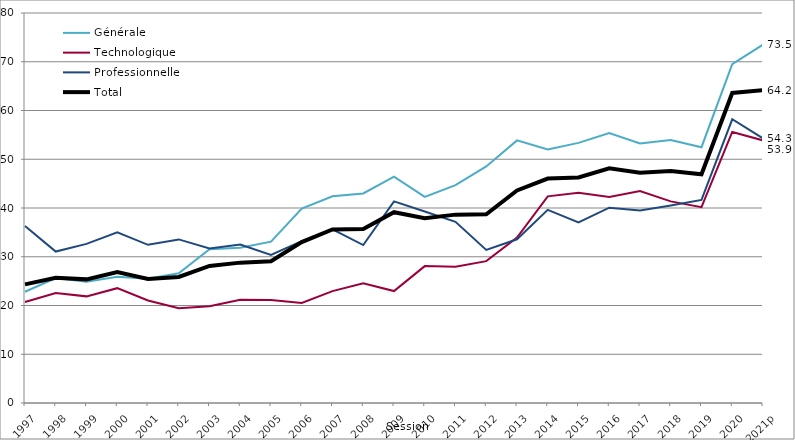
| Category | Générale | Technologique | Professionnelle | Total |
|---|---|---|---|---|
| 1997 | 22.818 | 20.715 | 36.321 | 24.326 |
| 1998 | 25.647 | 22.577 | 31.066 | 25.675 |
| 1999 | 24.878 | 21.873 | 32.634 | 25.361 |
| 2000 | 25.92 | 23.555 | 34.996 | 26.852 |
| 2001 | 25.47 | 21.037 | 32.446 | 25.459 |
| 2002 | 26.609 | 19.447 | 33.557 | 25.853 |
| 2003 | 31.536 | 19.859 | 31.708 | 28.105 |
| 2004 | 31.826 | 21.194 | 32.52 | 28.794 |
| 2005 | 33.105 | 21.134 | 30.36 | 29.074 |
| 2006 | 39.877 | 20.514 | 33.197 | 33.001 |
| 2007 | 42.416 | 22.946 | 35.612 | 35.592 |
| 2008 | 42.99 | 24.581 | 32.404 | 35.694 |
| 2009 | 46.45 | 22.956 | 41.37 | 39.136 |
| 2010 | 42.28 | 28.079 | 39.296 | 37.882 |
| 2011 | 44.695 | 27.957 | 37.172 | 38.641 |
| 2012 | 48.522 | 29.099 | 31.394 | 38.698 |
| 2013 | 53.872 | 33.942 | 33.584 | 43.592 |
| 2014 | 52.016 | 42.387 | 39.622 | 46.037 |
| 2015 | 53.353 | 43.117 | 37.058 | 46.269 |
| 2016 | 55.359 | 42.281 | 40.062 | 48.144 |
| 2017 | 53.247 | 43.473 | 39.47 | 47.256 |
| 2018 | 53.943 | 41.353 | 40.53 | 47.601 |
| 2019 | 52.47 | 40.16 | 41.65 | 46.91 |
| 2020 | 69.5 | 55.6 | 58.2 | 63.6 |
| 2021p | 73.513 | 53.87 | 54.284 | 64.182 |